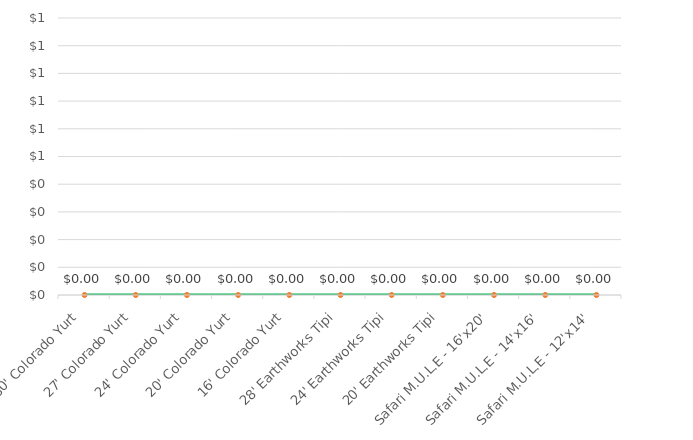
| Category | Series 1 |
|---|---|
| 30' Colorado Yurt | 0 |
| 27' Colorado Yurt | 0 |
| 24' Colorado Yurt | 0 |
| 20' Colorado Yurt | 0 |
| 16' Colorado Yurt | 0 |
| 28' Earthworks Tipi | 0 |
| 24' Earthworks Tipi | 0 |
| 20' Earthworks Tipi | 0 |
| Safari M.U.L.E - 16'x20' | 0 |
| Safari M.U.L.E - 14'x16' | 0 |
| Safari M.U.L.E - 12'x14' | 0 |